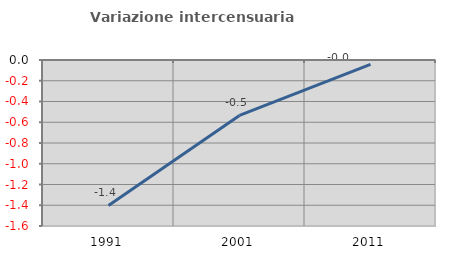
| Category | Variazione intercensuaria annua |
|---|---|
| 1991.0 | -1.402 |
| 2001.0 | -0.535 |
| 2011.0 | -0.042 |